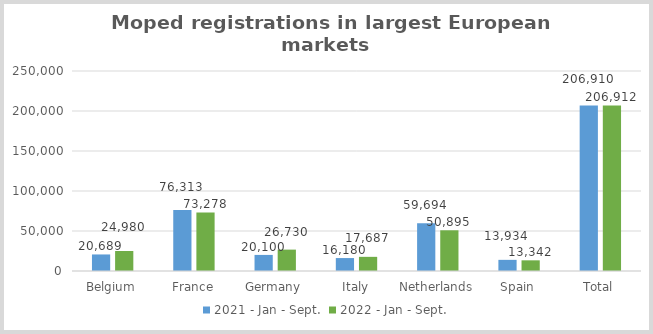
| Category | 2021 - Jan - Sept. | 2022 - Jan - Sept. |
|---|---|---|
| Belgium | 20689 | 24980 |
| France | 76313 | 73278 |
| Germany | 20100 | 26730 |
| Italy | 16180 | 17687 |
| Netherlands | 59694 | 50895 |
| Spain | 13934 | 13342 |
| Total | 206910 | 206912 |